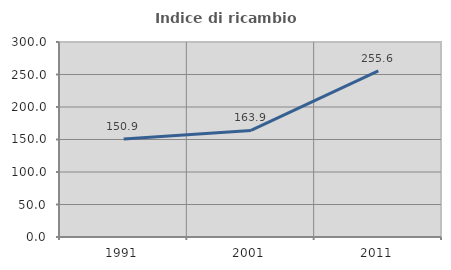
| Category | Indice di ricambio occupazionale  |
|---|---|
| 1991.0 | 150.893 |
| 2001.0 | 163.889 |
| 2011.0 | 255.556 |